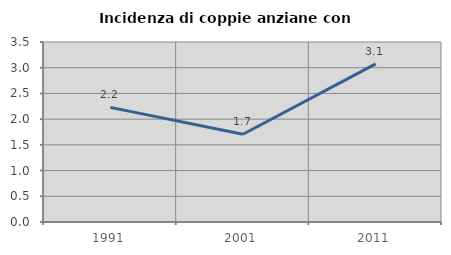
| Category | Incidenza di coppie anziane con figli |
|---|---|
| 1991.0 | 2.229 |
| 2001.0 | 1.707 |
| 2011.0 | 3.075 |